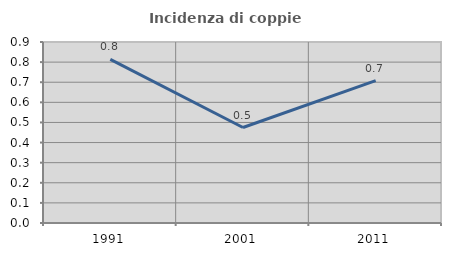
| Category | Incidenza di coppie miste |
|---|---|
| 1991.0 | 0.813 |
| 2001.0 | 0.475 |
| 2011.0 | 0.708 |